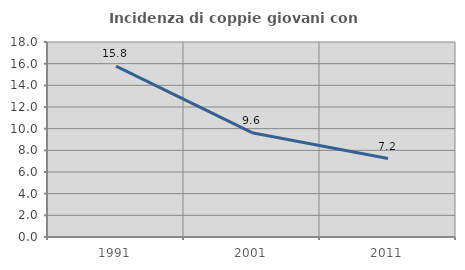
| Category | Incidenza di coppie giovani con figli |
|---|---|
| 1991.0 | 15.773 |
| 2001.0 | 9.629 |
| 2011.0 | 7.237 |